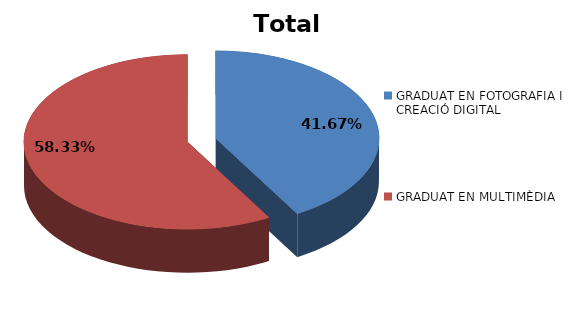
| Category | Series 0 |
|---|---|
| GRADUAT EN FOTOGRAFIA I CREACIÓ DIGITAL | 10 |
| GRADUAT EN MULTIMÈDIA | 14 |